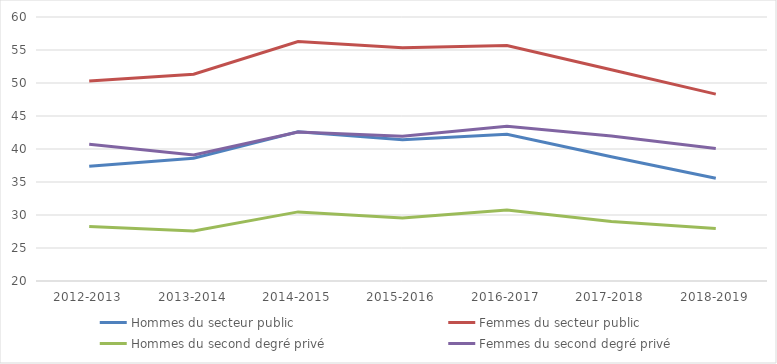
| Category | Hommes du secteur public | Femmes du secteur public | Hommes du second degré privé | Femmes du second degré privé |
|---|---|---|---|---|
| 2012-2013 | 37.37 | 50.32 | 28.26 | 40.71 |
| 2013-2014 | 38.61 | 51.32 | 27.57 | 39.08 |
| 2014-2015 | 42.61 | 56.27 | 30.47 | 42.58 |
| 2015-2016 | 41.4 | 55.33 | 29.56 | 41.93 |
| 2016-2017 | 42.24 | 55.69 | 30.77 | 43.44 |
| 2017-2018 | 38.82 | 52 | 29.01 | 41.97 |
| 2018-2019 | 35.57 | 48.32 | 27.97 | 40.08 |